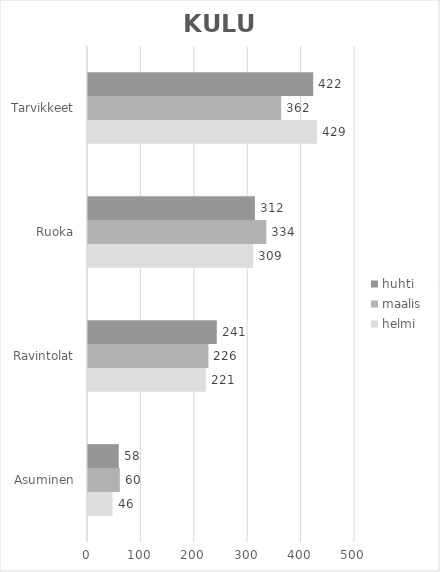
| Category | 2017 - helmi | 2017 - maalis | 2017 - huhti |
|---|---|---|---|
| Asuminen | 45.892 | 59.62 | 57.618 |
| Ravintolat | 220.718 | 225.571 | 241.113 |
| Ruoka | 309.222 | 333.967 | 312.492 |
| Tarvikkeet | 428.522 | 361.795 | 421.729 |